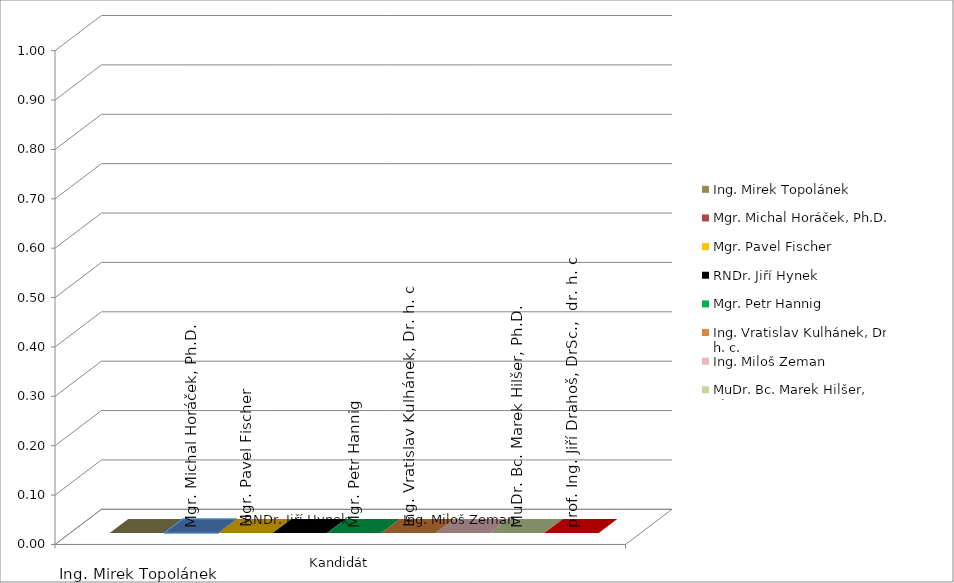
| Category | Ing. Mirek Topolánek | Mgr. Michal Horáček, Ph.D. | Mgr. Pavel Fischer | RNDr. Jiří Hynek | Mgr. Petr Hannig | Ing. Vratislav Kulhánek, Dr. h. c. | Ing. Miloš Zeman | MuDr. Bc. Marek Hilšer, Ph.D. | prof. Ing. Jiří Drahoš, DrSc.,  dr. h. c. |
|---|---|---|---|---|---|---|---|---|---|
| 0 | 0 | 0 | 0 | 0 | 0 | 0 | 0 | 0 | 0 |